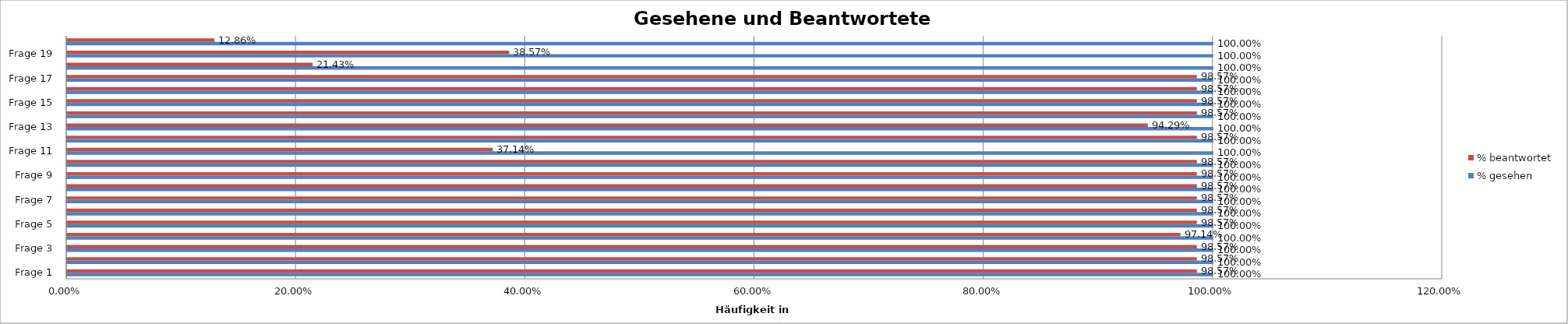
| Category | % gesehen | % beantwortet |
|---|---|---|
| Frage 1 | 1 | 0.986 |
| Frage 2 | 1 | 0.986 |
| Frage 3 | 1 | 0.986 |
| Frage 4 | 1 | 0.971 |
| Frage 5 | 1 | 0.986 |
| Frage 6 | 1 | 0.986 |
| Frage 7 | 1 | 0.986 |
| Frage 8 | 1 | 0.986 |
| Frage 9 | 1 | 0.986 |
| Frage 10 | 1 | 0.986 |
| Frage 11 | 1 | 0.371 |
| Frage 12 | 1 | 0.986 |
| Frage 13 | 1 | 0.943 |
| Frage 14 | 1 | 0.986 |
| Frage 15 | 1 | 0.986 |
| Frage 16 | 1 | 0.986 |
| Frage 17 | 1 | 0.986 |
| Frage 18 | 1 | 0.214 |
| Frage 19 | 1 | 0.386 |
| Frage 20 | 1 | 0.129 |